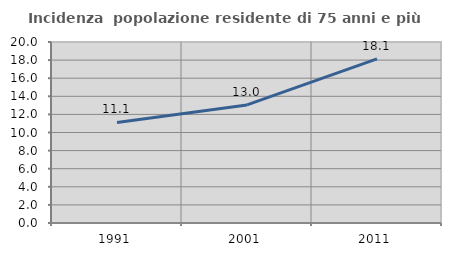
| Category | Incidenza  popolazione residente di 75 anni e più |
|---|---|
| 1991.0 | 11.105 |
| 2001.0 | 13.043 |
| 2011.0 | 18.142 |